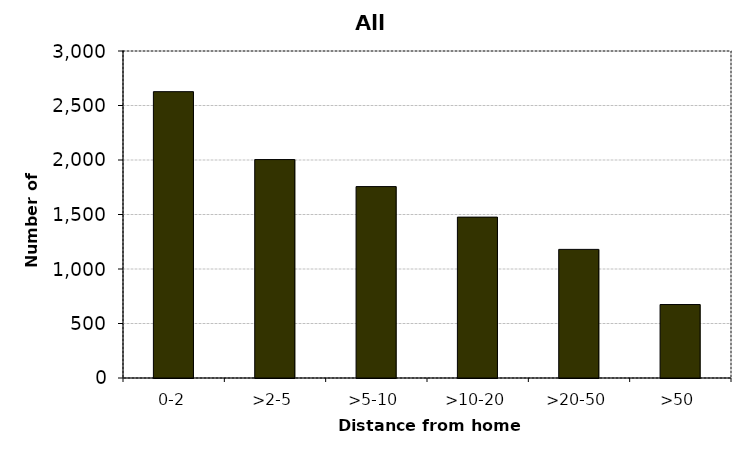
| Category | All drivers |
|---|---|
| 0-2 | 2627 |
| >2-5 | 2004 |
| >5-10 | 1756 |
| >10-20 | 1476 |
| >20-50 | 1180 |
| >50 | 674 |